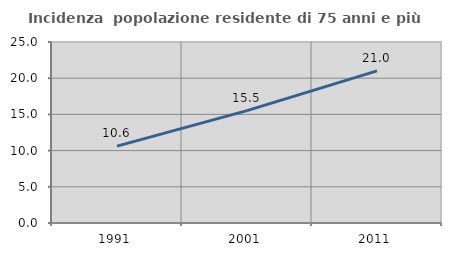
| Category | Incidenza  popolazione residente di 75 anni e più |
|---|---|
| 1991.0 | 10.619 |
| 2001.0 | 15.523 |
| 2011.0 | 21.005 |